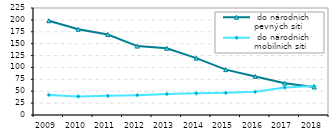
| Category |  do národních pevných sítí  |  do národních mobilních sítí  |
|---|---|---|
| 2009.0 | 198.196 | 42.101 |
| 2010.0 | 180.219 | 39.096 |
| 2011.0 | 169.354 | 40.37 |
| 2012.0 | 144.891 | 41.585 |
| 2013.0 | 140.2 | 44.148 |
| 2014.0 | 119.545 | 45.548 |
| 2015.0 | 95.416 | 46.532 |
| 2016.0 | 81.097 | 48.702 |
| 2017.0 | 66.857 | 57.682 |
| 2018.0 | 58.984 | 60.765 |